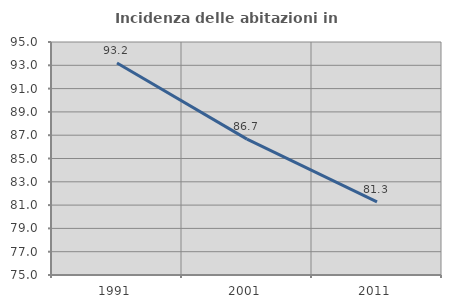
| Category | Incidenza delle abitazioni in proprietà  |
|---|---|
| 1991.0 | 93.204 |
| 2001.0 | 86.667 |
| 2011.0 | 81.271 |